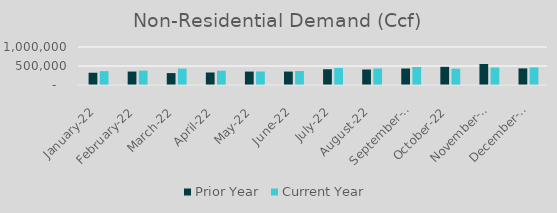
| Category | Prior Year | Current Year |
|---|---|---|
| 2022-01-01 | 322657.16 | 364164.019 |
| 2022-02-01 | 354041 | 377149.369 |
| 2022-03-01 | 313343 | 432270.798 |
| 2022-04-01 | 329084.722 | 376255.784 |
| 2022-05-01 | 353085 | 354792 |
| 2022-06-01 | 353141.442 | 367009.666 |
| 2022-07-01 | 414577.112 | 446288 |
| 2022-08-01 | 407774.995 | 434730.757 |
| 2022-09-01 | 434192.442 | 474194 |
| 2022-10-01 | 477878.526 | 430055 |
| 2022-11-01 | 552599.698 | 460152.938 |
| 2022-12-01 | 436956.784 | 462129.205 |